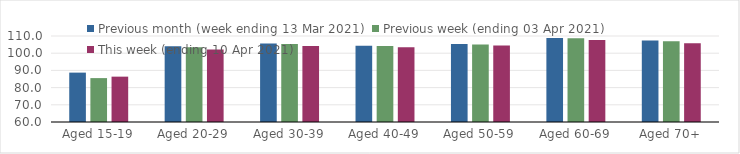
| Category | Previous month (week ending 13 Mar 2021) | Previous week (ending 03 Apr 2021) | This week (ending 10 Apr 2021) |
|---|---|---|---|
| Aged 15-19 | 88.71 | 85.52 | 86.37 |
| Aged 20-29 | 103.97 | 103.41 | 102.14 |
| Aged 30-39 | 105.58 | 105.39 | 104.24 |
| Aged 40-49 | 104.32 | 104.12 | 103.4 |
| Aged 50-59 | 105.3 | 105.02 | 104.44 |
| Aged 60-69 | 108.86 | 108.69 | 107.64 |
| Aged 70+ | 107.4 | 107.01 | 105.83 |